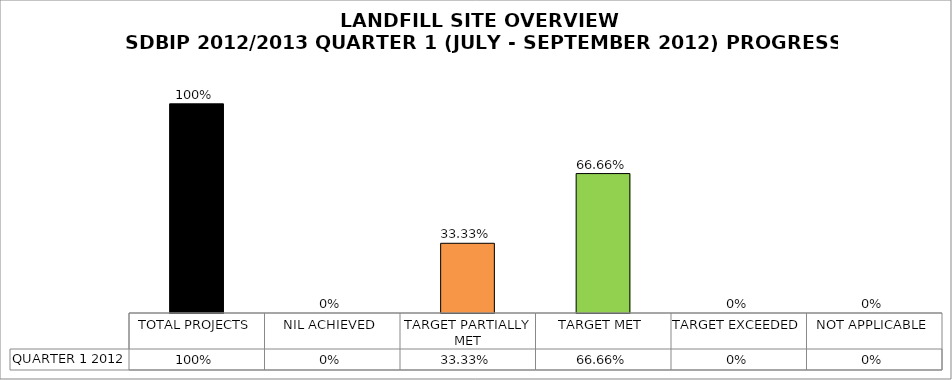
| Category | QUARTER 1 2012 |
|---|---|
| TOTAL PROJECTS | 1 |
| NIL ACHIEVED | 0 |
| TARGET PARTIALLY MET | 0.333 |
| TARGET MET | 0.667 |
| TARGET EXCEEDED | 0 |
| NOT APPLICABLE | 0 |